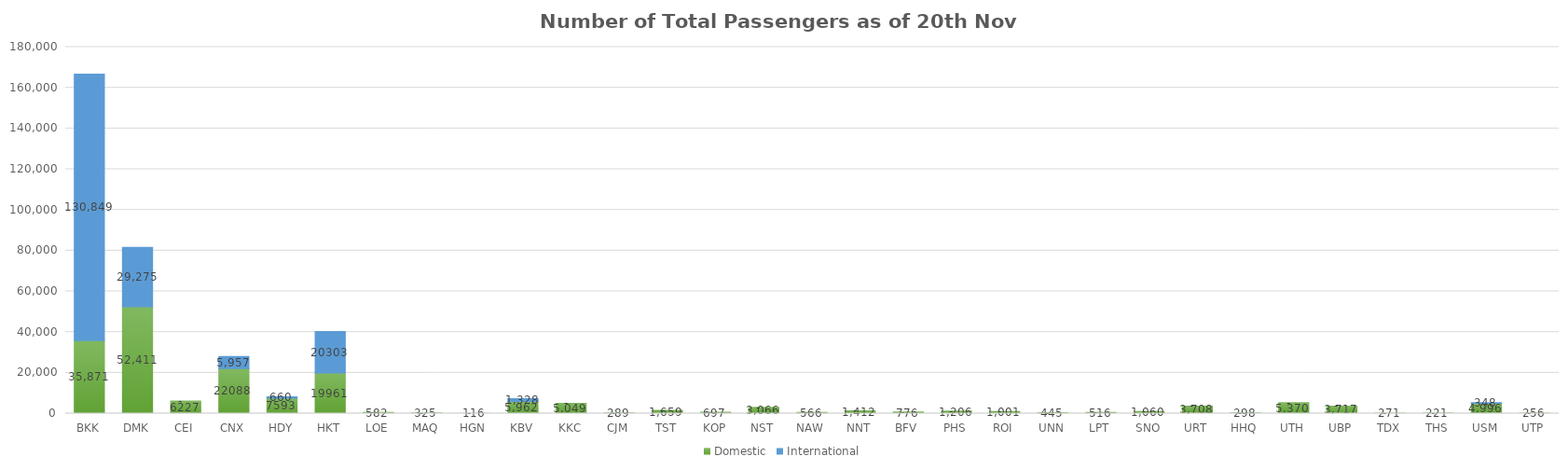
| Category | Domestic | International |
|---|---|---|
| BKK | 35871 | 130849 |
| DMK | 52411 | 29275 |
| CEI | 6227 | 0 |
| CNX | 22088 | 5957 |
| HDY | 7593 | 660 |
| HKT | 19961 | 20303 |
| LOE | 582 | 0 |
| MAQ | 325 | 0 |
| HGN | 116 | 0 |
| KBV | 5962 | 1328 |
| KKC | 5049 | 0 |
| CJM | 289 | 0 |
| TST | 1659 | 0 |
| KOP | 697 | 0 |
| NST | 3066 | 0 |
| NAW | 566 | 0 |
| NNT | 1412 | 0 |
| BFV | 776 | 0 |
| PHS | 1206 | 0 |
| ROI | 1001 | 0 |
| UNN | 445 | 0 |
| LPT | 516 | 0 |
| SNO | 1060 | 0 |
| URT | 3708 | 0 |
| HHQ | 298 | 0 |
| UTH | 5370 | 0 |
| UBP | 3717 | 0 |
| TDX | 271 | 0 |
| THS | 221 | 0 |
| USM | 4996 | 348 |
| UTP | 256 | 0 |